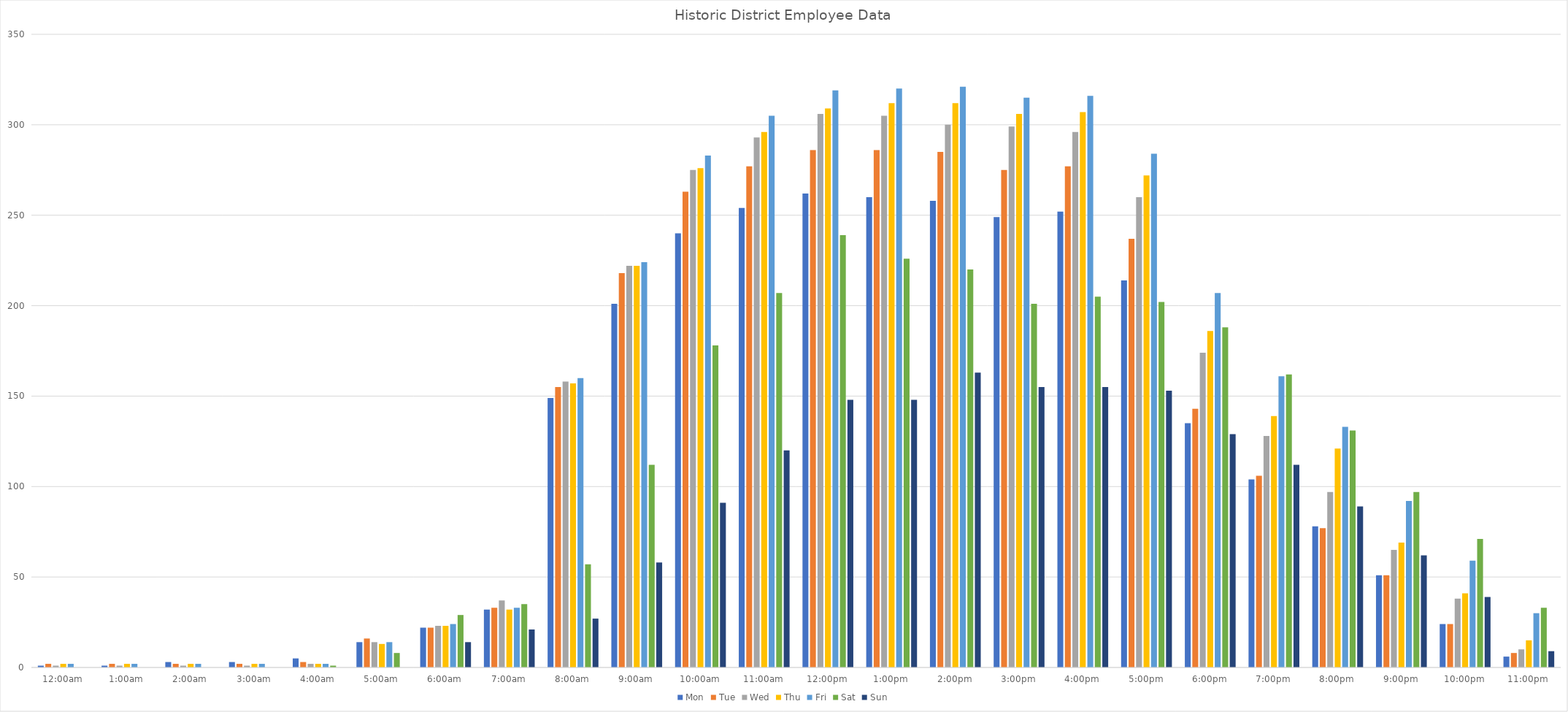
| Category | Mon | Tue | Wed | Thu | Fri | Sat | Sun |
|---|---|---|---|---|---|---|---|
| 12:00am | 1 | 2 | 1 | 2 | 2 | 0 | 0 |
| 1:00am | 1 | 2 | 1 | 2 | 2 | 0 | 0 |
| 2:00am | 3 | 2 | 1 | 2 | 2 | 0 | 0 |
| 3:00am | 3 | 2 | 1 | 2 | 2 | 0 | 0 |
| 4:00am | 5 | 3 | 2 | 2 | 2 | 1 | 0 |
| 5:00am | 14 | 16 | 14 | 13 | 14 | 8 | 0 |
| 6:00am | 22 | 22 | 23 | 23 | 24 | 29 | 14 |
| 7:00am | 32 | 33 | 37 | 32 | 33 | 35 | 21 |
| 8:00am | 149 | 155 | 158 | 157 | 160 | 57 | 27 |
| 9:00am | 201 | 218 | 222 | 222 | 224 | 112 | 58 |
| 10:00am | 240 | 263 | 275 | 276 | 283 | 178 | 91 |
| 11:00am | 254 | 277 | 293 | 296 | 305 | 207 | 120 |
| 12:00pm | 262 | 286 | 306 | 309 | 319 | 239 | 148 |
| 1:00pm | 260 | 286 | 305 | 312 | 320 | 226 | 148 |
| 2:00pm | 258 | 285 | 300 | 312 | 321 | 220 | 163 |
| 3:00pm | 249 | 275 | 299 | 306 | 315 | 201 | 155 |
| 4:00pm | 252 | 277 | 296 | 307 | 316 | 205 | 155 |
| 5:00pm | 214 | 237 | 260 | 272 | 284 | 202 | 153 |
| 6:00pm | 135 | 143 | 174 | 186 | 207 | 188 | 129 |
| 7:00pm | 104 | 106 | 128 | 139 | 161 | 162 | 112 |
| 8:00pm | 78 | 77 | 97 | 121 | 133 | 131 | 89 |
| 9:00pm | 51 | 51 | 65 | 69 | 92 | 97 | 62 |
| 10:00pm | 24 | 24 | 38 | 41 | 59 | 71 | 39 |
| 11:00pm | 6 | 8 | 10 | 15 | 30 | 33 | 9 |